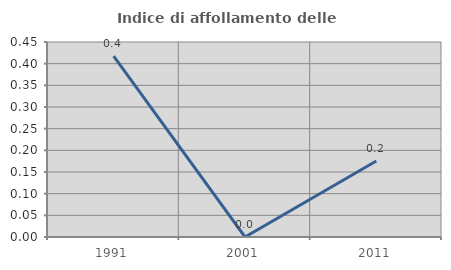
| Category | Indice di affollamento delle abitazioni  |
|---|---|
| 1991.0 | 0.418 |
| 2001.0 | 0 |
| 2011.0 | 0.175 |